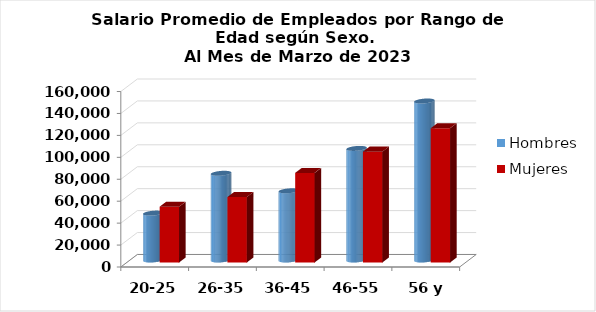
| Category | Hombres | Mujeres |
|---|---|---|
| 20-25 | 42763.636 | 50917.5 |
| 26-35 | 79065.622 | 59694.862 |
| 36-45 | 63107.342 | 81714.247 |
| 46-55 | 101753.75 | 101097.957 |
| 56 y más | 144979.4 | 122446.822 |